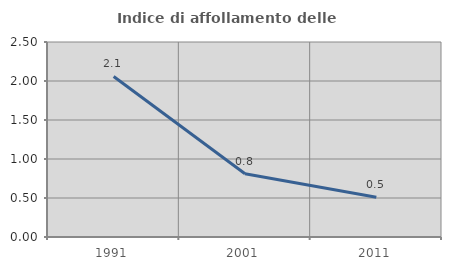
| Category | Indice di affollamento delle abitazioni  |
|---|---|
| 1991.0 | 2.058 |
| 2001.0 | 0.812 |
| 2011.0 | 0.509 |